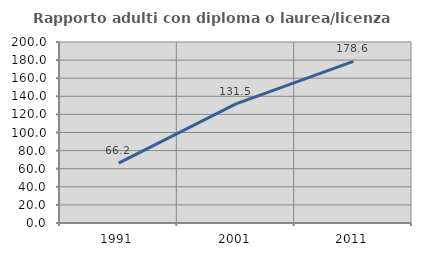
| Category | Rapporto adulti con diploma o laurea/licenza media  |
|---|---|
| 1991.0 | 66.184 |
| 2001.0 | 131.542 |
| 2011.0 | 178.58 |